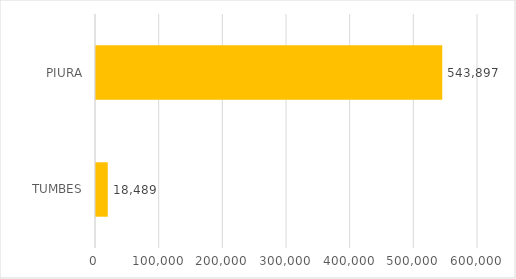
| Category | Series 0 |
|---|---|
| TUMBES | 18489 |
| PIURA | 543897 |